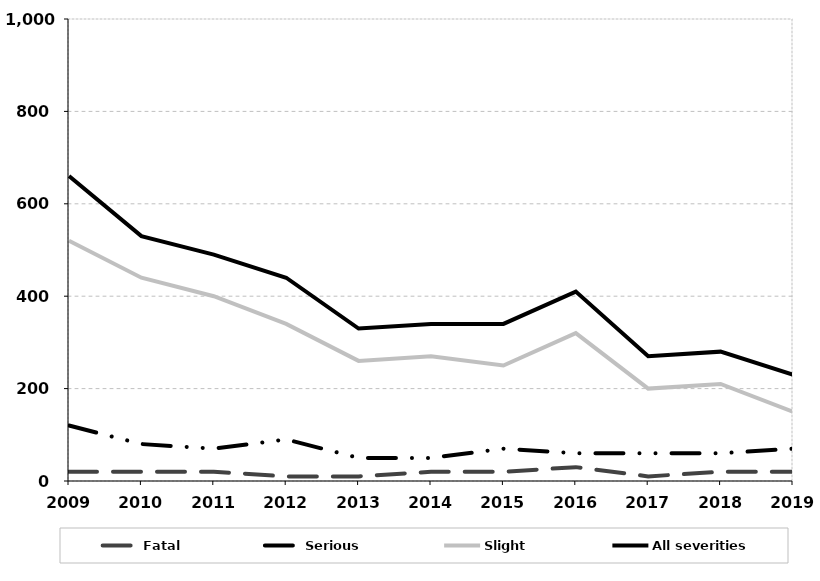
| Category | Fatal | Serious | Slight | All severities |
|---|---|---|---|---|
| 2009.0 | 20 | 120 | 520 | 660 |
| 2010.0 | 20 | 80 | 440 | 530 |
| 2011.0 | 20 | 70 | 400 | 490 |
| 2012.0 | 10 | 90 | 340 | 440 |
| 2013.0 | 10 | 50 | 260 | 330 |
| 2014.0 | 20 | 50 | 270 | 340 |
| 2015.0 | 20 | 70 | 250 | 340 |
| 2016.0 | 30 | 60 | 320 | 410 |
| 2017.0 | 10 | 60 | 200 | 270 |
| 2018.0 | 20 | 60 | 210 | 280 |
| 2019.0 | 20 | 70 | 150 | 230 |